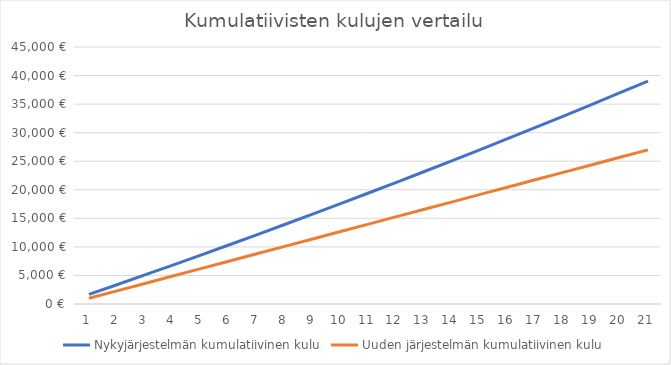
| Category | Nykyjärjestelmän kumulatiivinen kulu | Uuden järjestelmän kumulatiivinen kulu |
|---|---|---|
| 0 | 1680 | 1000 |
| 1 | 3376.8 | 2299.2 |
| 2 | 5090.568 | 3598.4 |
| 3 | 6821.474 | 4897.6 |
| 4 | 8569.688 | 6196.8 |
| 5 | 10335.385 | 7496 |
| 6 | 12118.739 | 8795.2 |
| 7 | 13919.927 | 10094.4 |
| 8 | 15739.126 | 11393.6 |
| 9 | 17576.517 | 12692.8 |
| 10 | 19432.282 | 13992 |
| 11 | 21306.605 | 15291.2 |
| 12 | 23199.671 | 16590.4 |
| 13 | 25111.668 | 17889.6 |
| 14 | 27042.785 | 19188.8 |
| 15 | 28993.212 | 20488 |
| 16 | 30963.144 | 21787.2 |
| 17 | 32952.776 | 23086.4 |
| 18 | 34962.304 | 24385.6 |
| 19 | 36991.927 | 25684.8 |
| 20 | 39041.846 | 26984 |